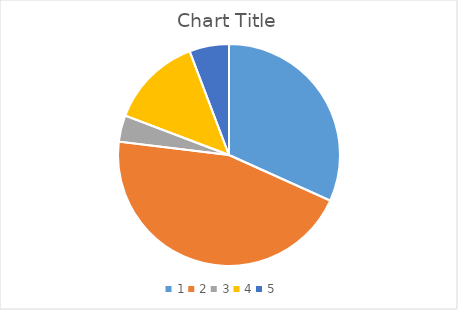
| Category | Series 0 |
|---|---|
| 0 | 31.731 |
| 1 | 45.192 |
| 2 | 3.846 |
| 3 | 13.462 |
| 4 | 5.769 |